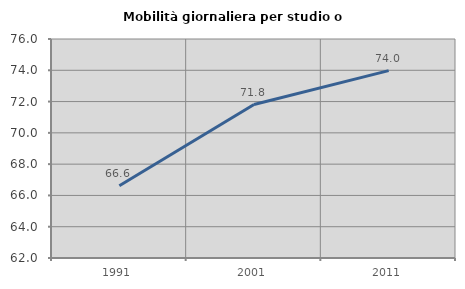
| Category | Mobilità giornaliera per studio o lavoro |
|---|---|
| 1991.0 | 66.619 |
| 2001.0 | 71.808 |
| 2011.0 | 73.978 |